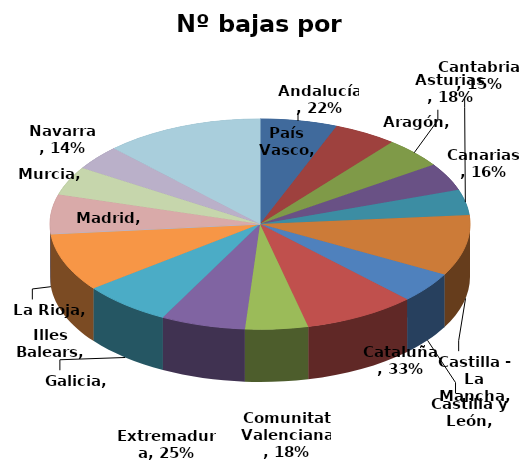
| Category | Nº bajas por enfermedad |
|---|---|
| Andalucía | 0.224 |
| Aragón | 0.183 |
| Asturias | 0.176 |
| Canarias | 0.16 |
| Cantabria | 0.148 |
| Castilla - La Mancha | 0.353 |
| Castilla y León | 0.177 |
| Cataluña | 0.327 |
| Comunitat Valenciana | 0.182 |
| Extremadura | 0.246 |
| Galicia | 0.26 |
| Illes Balears | 0.339 |
| La Rioja | 0 |
| Madrid | 0.228 |
| Murcia | 0.167 |
| Navarra | 0.143 |
| País Vasco | 0.462 |